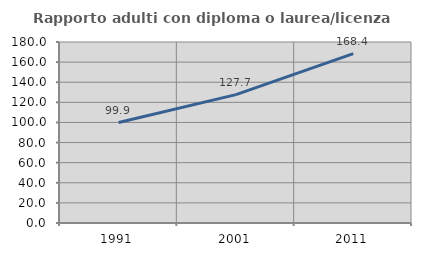
| Category | Rapporto adulti con diploma o laurea/licenza media  |
|---|---|
| 1991.0 | 99.911 |
| 2001.0 | 127.669 |
| 2011.0 | 168.416 |